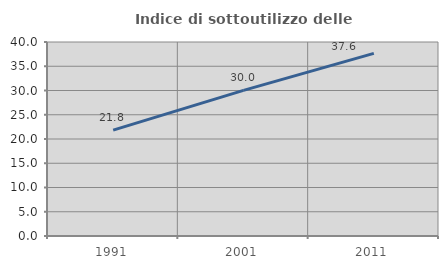
| Category | Indice di sottoutilizzo delle abitazioni  |
|---|---|
| 1991.0 | 21.843 |
| 2001.0 | 30.029 |
| 2011.0 | 37.648 |